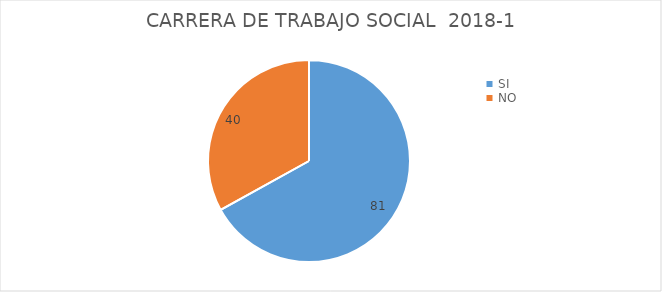
| Category | Series 0 |
|---|---|
| SI | 81 |
| NO | 40 |